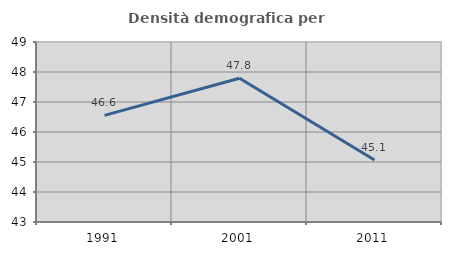
| Category | Densità demografica |
|---|---|
| 1991.0 | 46.555 |
| 2001.0 | 47.793 |
| 2011.0 | 45.069 |